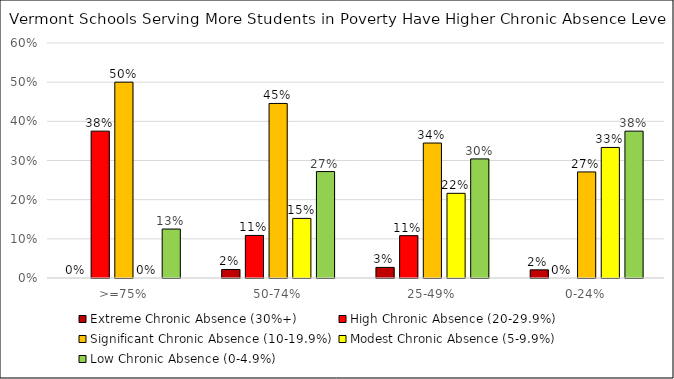
| Category | Extreme Chronic Absence (30%+) | High Chronic Absence (20-29.9%) | Significant Chronic Absence (10-19.9%) | Modest Chronic Absence (5-9.9%) | Low Chronic Absence (0-4.9%) |
|---|---|---|---|---|---|
| >=75% | 0 | 0.375 | 0.5 | 0 | 0.125 |
| 50-74% | 0.022 | 0.109 | 0.446 | 0.152 | 0.272 |
| 25-49% | 0.027 | 0.108 | 0.345 | 0.216 | 0.304 |
| 0-24% | 0.021 | 0 | 0.271 | 0.333 | 0.375 |